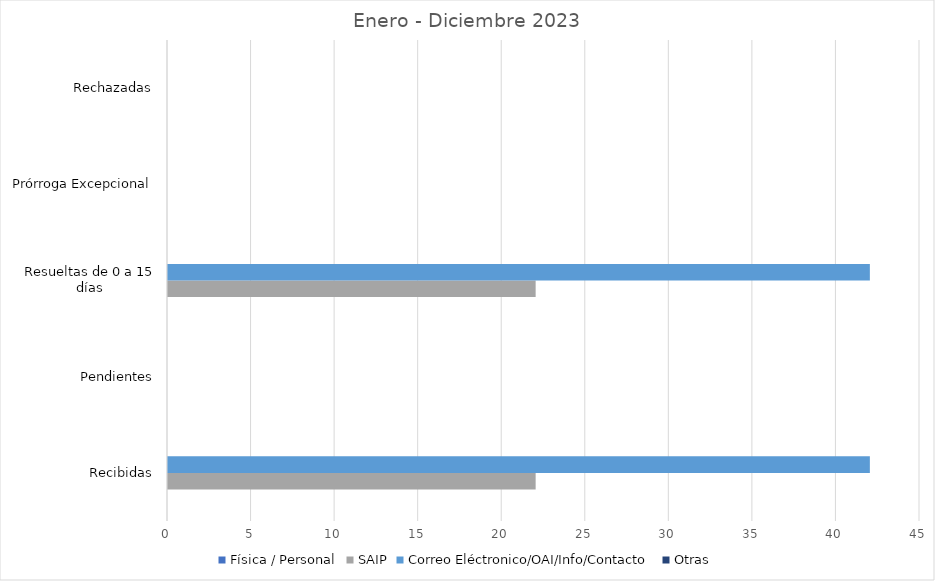
| Category | Física / Personal | SAIP | Correo Eléctronico/OAI/Info/Contacto | Otras |
|---|---|---|---|---|
| Recibidas | 0 | 22 | 42 | 0 |
| Pendientes | 0 | 0 | 0 | 0 |
| Resueltas de 0 a 15 días | 0 | 22 | 42 | 0 |
| Prórroga Excepcional | 0 | 0 | 0 | 0 |
| Rechazadas | 0 | 0 | 0 | 0 |